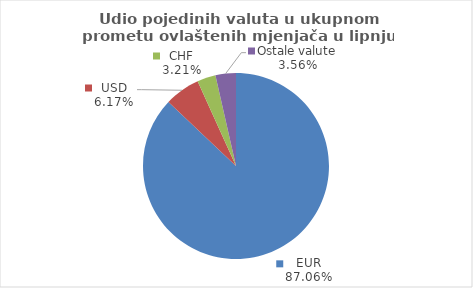
| Category | Series 0 |
|---|---|
| EUR | 87.059 |
| USD | 6.174 |
| CHF | 3.21 |
| Ostale valute | 3.557 |